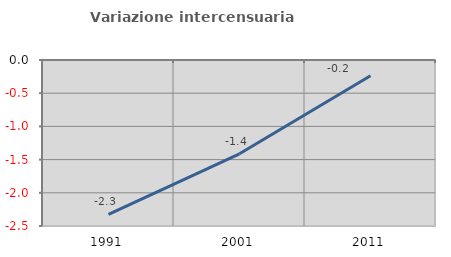
| Category | Variazione intercensuaria annua |
|---|---|
| 1991.0 | -2.326 |
| 2001.0 | -1.413 |
| 2011.0 | -0.238 |